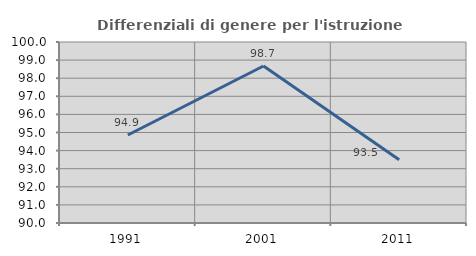
| Category | Differenziali di genere per l'istruzione superiore |
|---|---|
| 1991.0 | 94.861 |
| 2001.0 | 98.675 |
| 2011.0 | 93.498 |